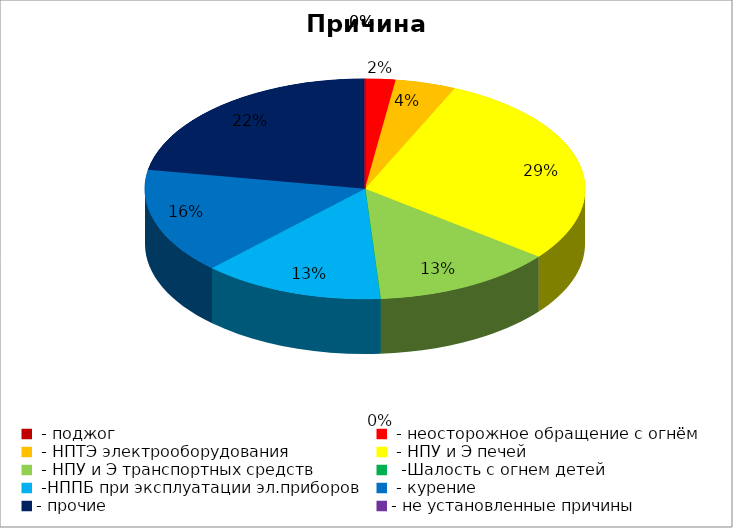
| Category | Причина пожара |
|---|---|
|  - поджог | 0 |
|  - неосторожное обращение с огнём | 1 |
|  - НПТЭ электрооборудования | 2 |
|  - НПУ и Э печей | 13 |
|  - НПУ и Э транспортных средств | 6 |
|   -Шалость с огнем детей | 0 |
|  -НППБ при эксплуатации эл.приборов | 6 |
|  - курение | 7 |
| - прочие | 10 |
| - не установленные причины | 0 |